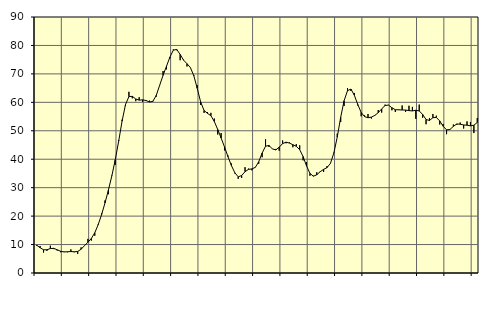
| Category | Piggar | Series 1 |
|---|---|---|
| nan | 9.5 | 9.77 |
| 87.0 | 9.5 | 8.88 |
| 87.0 | 7.2 | 8.17 |
| 87.0 | 7.8 | 8.17 |
| nan | 9.6 | 8.6 |
| 88.0 | 8.4 | 8.66 |
| 88.0 | 7.9 | 8.16 |
| 88.0 | 7.3 | 7.64 |
| nan | 7.5 | 7.4 |
| 89.0 | 7.3 | 7.47 |
| 89.0 | 8.3 | 7.54 |
| 89.0 | 7.3 | 7.45 |
| nan | 6.7 | 7.58 |
| 90.0 | 9 | 8.34 |
| 90.0 | 9.7 | 9.63 |
| 90.0 | 12 | 10.82 |
| nan | 11.4 | 12.14 |
| 91.0 | 13.1 | 14.15 |
| 91.0 | 17.2 | 16.98 |
| 91.0 | 21 | 20.53 |
| nan | 25.5 | 24.63 |
| 92.0 | 27.7 | 29.2 |
| 92.0 | 34.3 | 34.16 |
| 92.0 | 38 | 39.82 |
| nan | 46.7 | 46.35 |
| 93.0 | 53.9 | 53.38 |
| 93.0 | 58.7 | 59.24 |
| 93.0 | 63.7 | 62.02 |
| nan | 61.4 | 62.11 |
| 94.0 | 60.4 | 61.18 |
| 94.0 | 61.8 | 60.77 |
| 94.0 | 60.2 | 60.88 |
| nan | 60.8 | 60.64 |
| 95.0 | 60.6 | 60.13 |
| 95.0 | 60.5 | 60.33 |
| 95.0 | 62 | 62.44 |
| nan | 65.9 | 65.99 |
| 96.0 | 71 | 69.5 |
| 96.0 | 71.6 | 72.68 |
| 96.0 | 75.4 | 75.91 |
| nan | 78.6 | 78.34 |
| 97.0 | 78.3 | 78.59 |
| 97.0 | 74.8 | 76.85 |
| 97.0 | 75 | 74.83 |
| nan | 72.6 | 73.58 |
| 98.0 | 72.3 | 72.22 |
| 98.0 | 69.6 | 69.35 |
| 98.0 | 66 | 64.94 |
| nan | 59.1 | 60.13 |
| 99.0 | 56.3 | 57.14 |
| 99.0 | 56.6 | 56.12 |
| 99.0 | 56.3 | 55.31 |
| nan | 54.3 | 53.27 |
| 0.0 | 48.7 | 50.46 |
| 0.0 | 49.2 | 47.44 |
| 0.0 | 43.1 | 44.29 |
| nan | 41.3 | 40.9 |
| 1.0 | 38.5 | 37.79 |
| 1.0 | 35 | 35.26 |
| 1.0 | 33.1 | 33.81 |
| nan | 33.4 | 34.27 |
| 2.0 | 37.2 | 35.61 |
| 2.0 | 36.7 | 36.43 |
| 2.0 | 36.1 | 36.6 |
| nan | 37.2 | 37.12 |
| 3.0 | 38.4 | 39.1 |
| 3.0 | 40.7 | 42.17 |
| 3.0 | 47 | 44.57 |
| nan | 44.3 | 44.83 |
| 4.0 | 43.7 | 43.65 |
| 4.0 | 43.6 | 43.26 |
| 4.0 | 43 | 44.25 |
| nan | 46.6 | 45.49 |
| 5.0 | 45.6 | 46.01 |
| 5.0 | 45.9 | 45.67 |
| 5.0 | 44.2 | 45.1 |
| nan | 45.3 | 44.55 |
| 6.0 | 44.9 | 43.35 |
| 6.0 | 39.6 | 40.95 |
| 6.0 | 39 | 37.66 |
| nan | 34.2 | 35.03 |
| 7.0 | 34.2 | 34.03 |
| 7.0 | 35.4 | 34.53 |
| 7.0 | 35.5 | 35.61 |
| nan | 35.5 | 36.44 |
| 8.0 | 37.6 | 37.04 |
| 8.0 | 38.6 | 38.52 |
| 8.0 | 42.3 | 42.19 |
| nan | 49 | 47.79 |
| 9.0 | 53.1 | 54.73 |
| 9.0 | 58.7 | 60.56 |
| 9.0 | 65 | 64.09 |
| nan | 64 | 64.67 |
| 10.0 | 63.3 | 62.5 |
| 10.0 | 58.9 | 59.26 |
| 10.0 | 55.1 | 56.45 |
| nan | 55.4 | 54.96 |
| 11.0 | 55.9 | 54.59 |
| 11.0 | 54.3 | 54.8 |
| 11.0 | 55.3 | 55.41 |
| nan | 57.3 | 56.36 |
| 12.0 | 56.4 | 57.69 |
| 12.0 | 59.2 | 58.88 |
| 12.0 | 59.1 | 59.03 |
| nan | 57.2 | 58.1 |
| 13.0 | 56.6 | 57.4 |
| 13.0 | 57.5 | 57.37 |
| 13.0 | 58.9 | 57.3 |
| nan | 56.6 | 57.29 |
| 14.0 | 58.8 | 57.09 |
| 14.0 | 58.4 | 56.98 |
| 14.0 | 54.2 | 57.22 |
| nan | 59.2 | 56.97 |
| 15.0 | 54.6 | 55.73 |
| 15.0 | 52.3 | 53.97 |
| 15.0 | 54.5 | 53.62 |
| nan | 55.9 | 54.6 |
| 16.0 | 55.3 | 54.69 |
| 16.0 | 52.2 | 53.47 |
| 16.0 | 52.4 | 51.61 |
| nan | 48.8 | 50.32 |
| 17.0 | 50.4 | 50.45 |
| 17.0 | 52.2 | 51.56 |
| 17.0 | 52.1 | 52.4 |
| nan | 52.9 | 52.29 |
| 18.0 | 50.8 | 52.05 |
| 18.0 | 53.3 | 51.96 |
| 18.0 | 53.1 | 51.74 |
| nan | 49.2 | 51.95 |
| 19.0 | 54.5 | 52.94 |